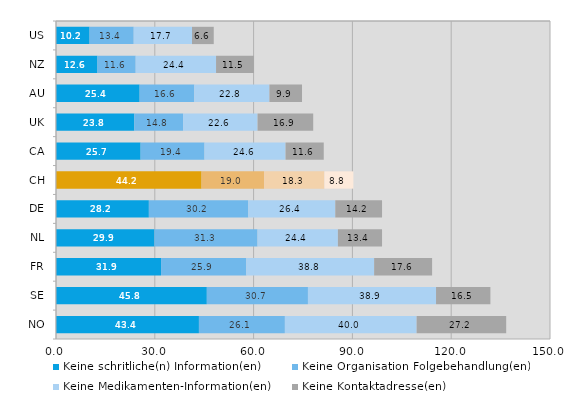
| Category | Keine schritliche(n) Information(en) | Keine Organisation Folgebehandlung(en) | Keine Medikamenten-Information(en) | Keine Kontaktadresse(en) |
|---|---|---|---|---|
| US | 10.2 | 13.4 | 17.7 | 6.6 |
| NZ | 12.6 | 11.6 | 24.4 | 11.5 |
| AU | 25.4 | 16.6 | 22.8 | 9.9 |
| UK | 23.8 | 14.8 | 22.6 | 16.9 |
| CA | 25.7 | 19.4 | 24.6 | 11.6 |
| CH | 44.2 | 19 | 18.3 | 8.8 |
| DE | 28.2 | 30.2 | 26.4 | 14.2 |
| NL | 29.9 | 31.3 | 24.4 | 13.4 |
| FR | 31.9 | 25.9 | 38.8 | 17.6 |
| SE | 45.8 | 30.7 | 38.9 | 16.5 |
| NO | 43.4 | 26.1 | 40 | 27.2 |